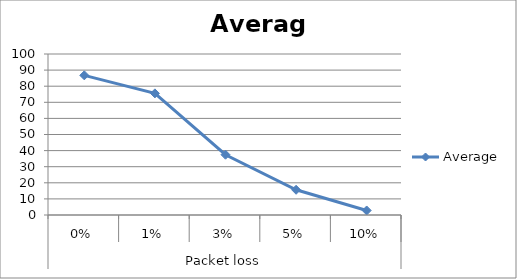
| Category | Average |
|---|---|
| 0 | 86.748 |
| 1 | 75.548 |
| 2 | 37.442 |
| 3 | 15.667 |
| 4 | 2.811 |